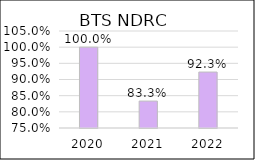
| Category | BTS NDRC |
|---|---|
| 2020.0 | 1 |
| 2021.0 | 0.833 |
| 2022.0 | 0.923 |